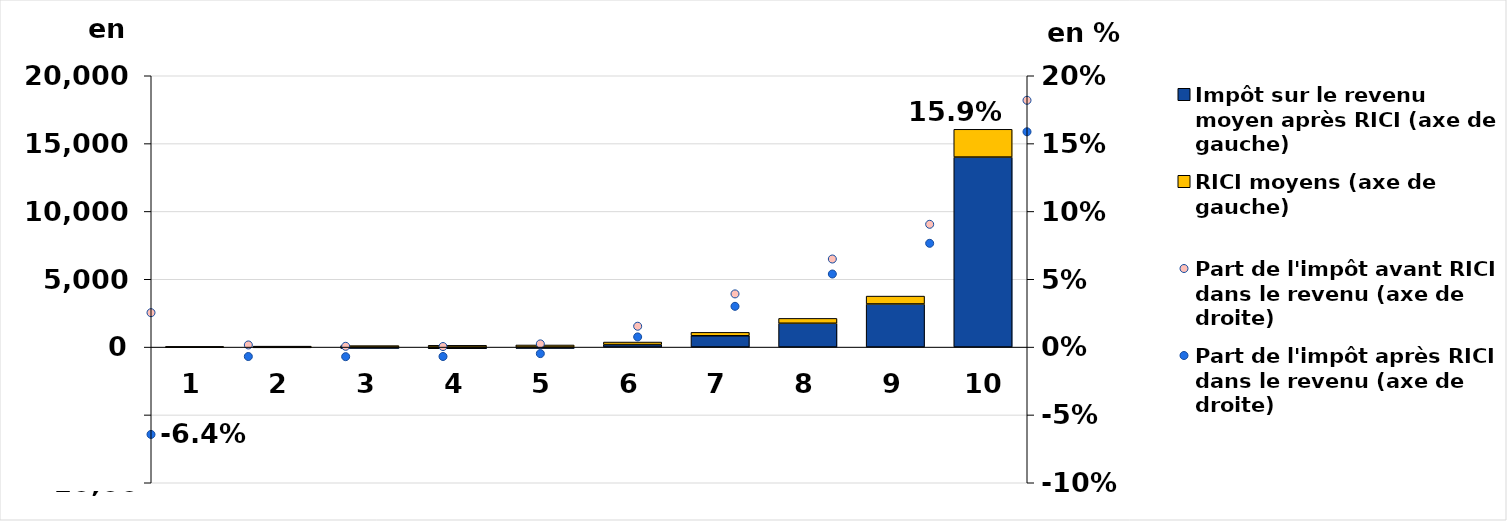
| Category | Impôt sur le revenu moyen après RICI (axe de gauche) | RICI moyens (axe de gauche) |
|---|---|---|
| 0 | -29.391 | 41.081 |
| 1 | -55.473 | 69.852 |
| 2 | -96.868 | 107.553 |
| 3 | -120.403 | 130.771 |
| 4 | -100.323 | 155.305 |
| 5 | 184.286 | 189.101 |
| 6 | 833.5 | 252.263 |
| 7 | 1756.42 | 359.416 |
| 8 | 3178.38 | 581.087 |
| 9 | 14005.01 | 2048.635 |